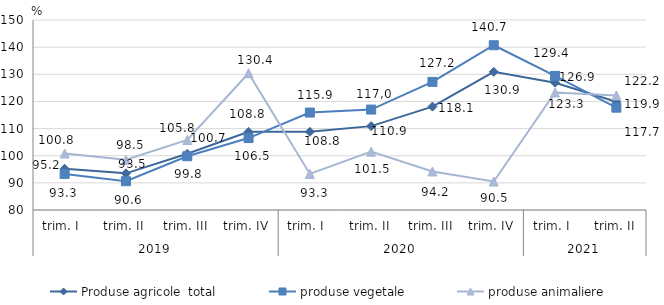
| Category | Produse agricole  total | produse vegetale | produse animaliere |
|---|---|---|---|
| 0 | 95.2 | 93.3 | 100.8 |
| 1 | 93.5 | 90.6 | 98.5 |
| 2 | 100.7 | 99.8 | 105.8 |
| 3 | 108.8 | 106.5 | 130.4 |
| 4 | 108.8 | 115.9 | 93.3 |
| 5 | 110.9 | 117 | 101.5 |
| 6 | 118.1 | 127.2 | 94.2 |
| 7 | 130.9 | 140.7 | 90.5 |
| 8 | 126.9 | 129.4 | 123.3 |
| 9 | 119.9 | 117.7 | 122.2 |